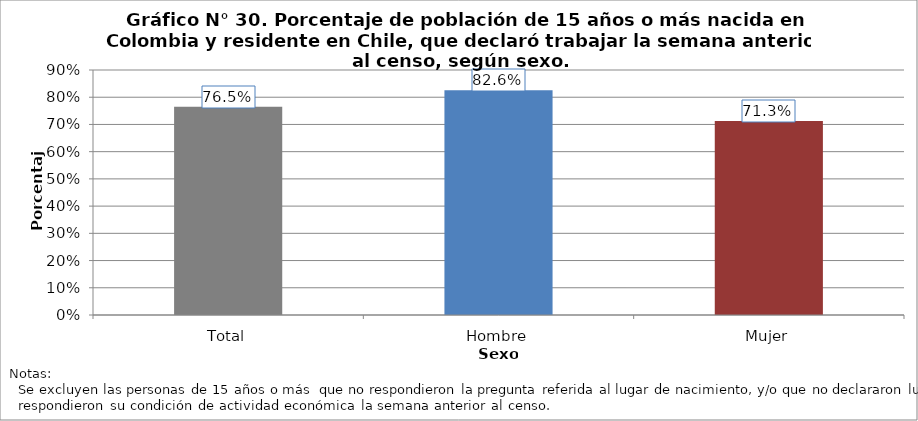
| Category | Población que declara trabajar  |
|---|---|
| Total | 0.765 |
| Hombre | 0.826 |
| Mujer | 0.713 |